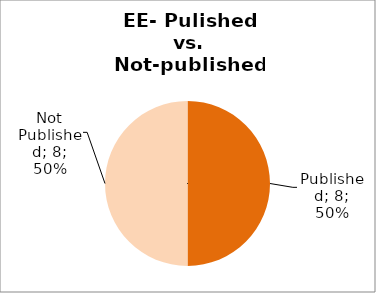
| Category | Series 0 |
|---|---|
| Published | 8 |
| Not Published | 8 |